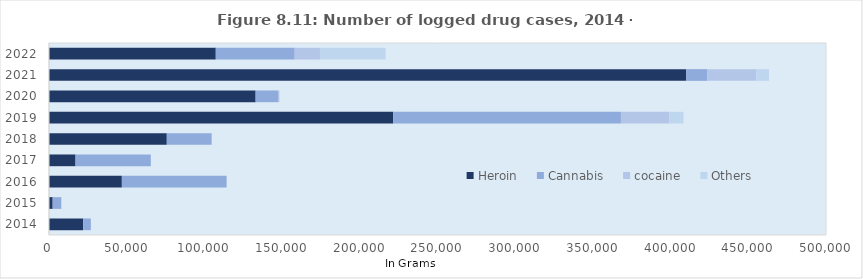
| Category | Heroin | Cannabis | cocaine | Others |
|---|---|---|---|---|
| 2014.0 | 21947.937 | 4977.311 | 0 | 0 |
| 2015.0 | 2359 | 5542 | 0 | 0 |
| 2016.0 | 46885.843 | 67393.072 | 0 | 0 |
| 2017.0 | 17064.192 | 48438.827 | 0 | 0 |
| 2018.0 | 75799.185 | 28862.109 | 0 | 0 |
| 2019.0 | 221508.684 | 146538.08 | 31034.91 | 9173.865 |
| 2020.0 | 132964.037 | 14409.404 | 891.867 | 0 |
| 2021.0 | 409944.885 | 13745.462 | 31505.142 | 8161.635 |
| 2022.0 | 107321.61 | 50794.764 | 16244.001 | 42253.625 |